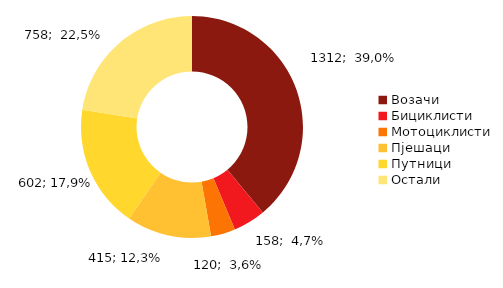
| Category | 2011 |
|---|---|
| Возачи | 1312 |
| Бициклисти | 158 |
| Мотоциклисти | 120 |
| Пјешаци | 415 |
| Путници | 602 |
| Остали | 758 |